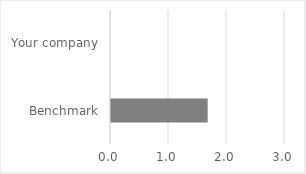
| Category | Production redundancy |
|---|---|
| Benchmark | 1.667 |
| Your company | 0 |